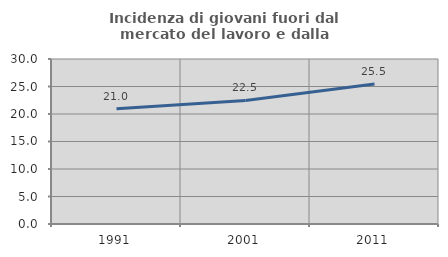
| Category | Incidenza di giovani fuori dal mercato del lavoro e dalla formazione  |
|---|---|
| 1991.0 | 20.973 |
| 2001.0 | 22.464 |
| 2011.0 | 25.45 |